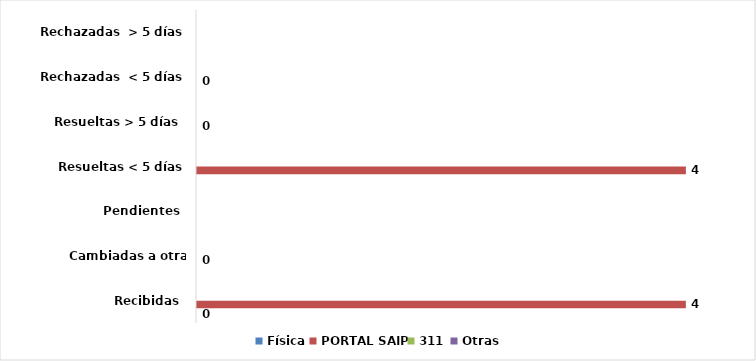
| Category | Física | PORTAL SAIP | 311 | Otras |
|---|---|---|---|---|
| Recibidas  | 0 | 4 | 0 | 0 |
| Cambiadas a otra institución | 0 | 0 | 0 | 0 |
| Pendientes  | 0 | 0 | 0 | 0 |
| Resueltas < 5 días | 0 | 4 | 0 | 0 |
| Resueltas > 5 días  | 0 | 0 | 0 | 0 |
| Rechazadas  < 5 días | 0 | 0 | 0 | 0 |
| Rechazadas  > 5 días | 0 | 0 | 0 | 0 |